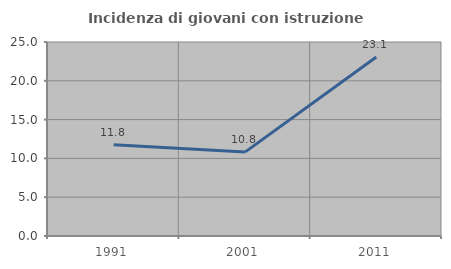
| Category | Incidenza di giovani con istruzione universitaria |
|---|---|
| 1991.0 | 11.765 |
| 2001.0 | 10.811 |
| 2011.0 | 23.077 |